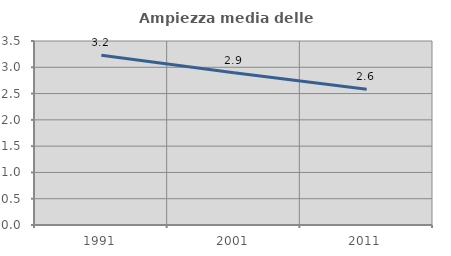
| Category | Ampiezza media delle famiglie |
|---|---|
| 1991.0 | 3.227 |
| 2001.0 | 2.897 |
| 2011.0 | 2.581 |